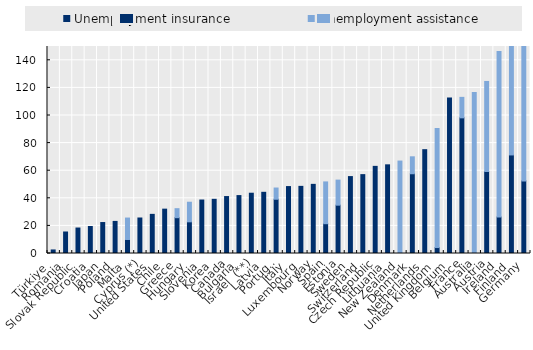
| Category | Unemployment insurance | Unemployment assistance |
|---|---|---|
| Türkiye  | 2.574 | 0 |
| Romania | 15.587 | 0 |
| Slovak Republic | 18.461 | 0 |
| Croatia | 19.55 | 0 |
| Japan | 22.441 | 0 |
| Poland | 23.249 | 0 |
| Malta | 10.159 | 15.537 |
| Cyprus (*) | 25.728 | 0 |
| United States | 28.366 | 0 |
| Chile | 32.135 | 0 |
| Greece | 25.952 | 6.529 |
| Hungary | 22.955 | 14.198 |
| Slovenia | 38.755 | 0 |
| Korea | 39.264 | 0 |
| Canada | 41.269 | 0 |
| Bulgaria | 41.968 | 0 |
| Israel  (**) | 43.682 | 0 |
| Latvia | 44.344 | 0 |
| Portugal | 39.313 | 8.133 |
| Italy | 48.504 | 0 |
| Luxembourg | 48.647 | 0 |
| Norway | 50.106 | 0 |
| Spain | 21.591 | 30.281 |
| Estonia | 35.02 | 18.161 |
| Sweden | 55.732 | 0 |
| Switzerland | 57.154 | 0 |
| Czech Republic | 63.14 | 0 |
| Lithuania | 64.253 | 0 |
| New Zealand | 0 | 66.989 |
| Denmark | 57.789 | 12.276 |
| Netherlands | 75.236 | 0 |
| United Kingdom | 4.306 | 86.256 |
| Belgium | 112.649 | 0 |
| France | 98.306 | 14.838 |
| Australia | 0 | 116.658 |
| Austria | 59.417 | 65.253 |
| Ireland | 26.44 | 119.97 |
| Finland | 71.413 | 94.032 |
| Germany | 52.625 | 210.689 |